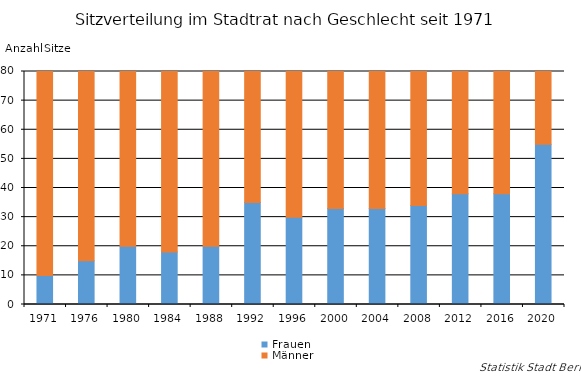
| Category | Frauen | Männer |
|---|---|---|
| 1971.0 | 10 | 70 |
| 1976.0 | 15 | 65 |
| 1980.0 | 20 | 60 |
| 1984.0 | 18 | 62 |
| 1988.0 | 20 | 60 |
| 1992.0 | 35 | 45 |
| 1996.0 | 30 | 50 |
| 2000.0 | 33 | 47 |
| 2004.0 | 33 | 47 |
| 2008.0 | 34 | 46 |
| 2012.0 | 38 | 42 |
| 2016.0 | 38 | 42 |
| 2020.0 | 55 | 25 |